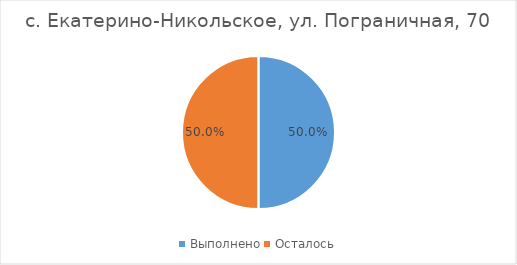
| Category | с. Екатерино-Никольское, ул. Пограничная, 70 |
|---|---|
| Выполнено | 0.5 |
| Осталось | 0.5 |